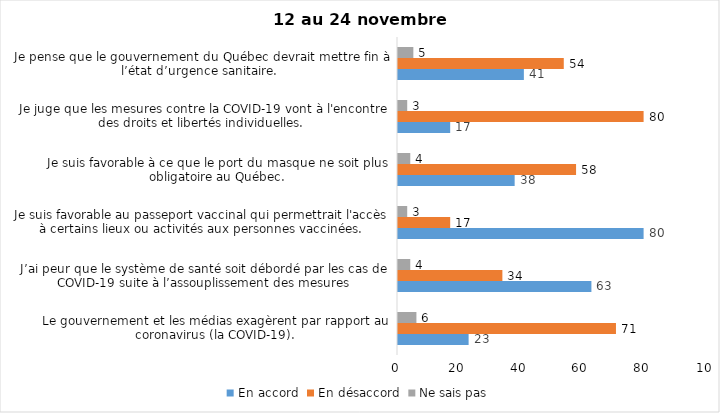
| Category | En accord | En désaccord | Ne sais pas |
|---|---|---|---|
| Le gouvernement et les médias exagèrent par rapport au coronavirus (la COVID-19). | 23 | 71 | 6 |
| J’ai peur que le système de santé soit débordé par les cas de COVID-19 suite à l’assouplissement des mesures | 63 | 34 | 4 |
| Je suis favorable au passeport vaccinal qui permettrait l'accès à certains lieux ou activités aux personnes vaccinées. | 80 | 17 | 3 |
| Je suis favorable à ce que le port du masque ne soit plus obligatoire au Québec. | 38 | 58 | 4 |
| Je juge que les mesures contre la COVID-19 vont à l'encontre des droits et libertés individuelles.  | 17 | 80 | 3 |
| Je pense que le gouvernement du Québec devrait mettre fin à l’état d’urgence sanitaire.  | 41 | 54 | 5 |